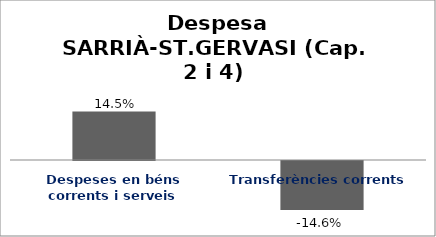
| Category | Series 0 |
|---|---|
| Despeses en béns corrents i serveis | 0.145 |
| Transferències corrents | -0.146 |